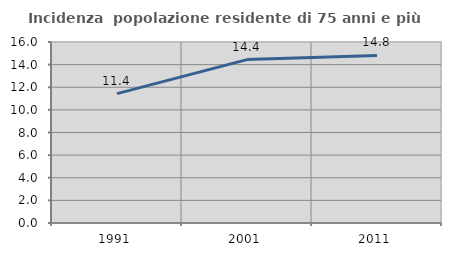
| Category | Incidenza  popolazione residente di 75 anni e più |
|---|---|
| 1991.0 | 11.439 |
| 2001.0 | 14.443 |
| 2011.0 | 14.807 |